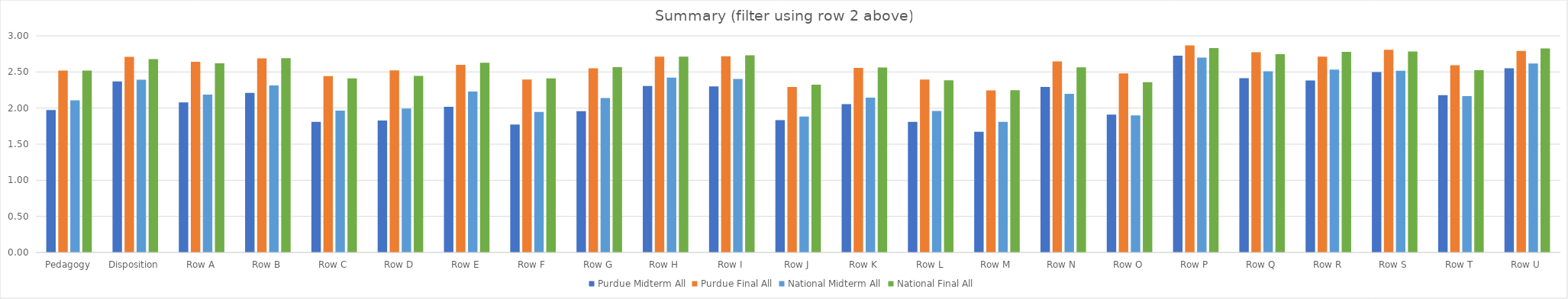
| Category | Purdue | National |
|---|---|---|
| Pedagogy | 2.52 | 2.518 |
| Disposition | 2.709 | 2.677 |
| Row A | 2.641 | 2.618 |
| Row B | 2.689 | 2.69 |
| Row C | 2.443 | 2.411 |
| Row D | 2.521 | 2.447 |
| Row E | 2.599 | 2.629 |
| Row F | 2.395 | 2.411 |
| Row G | 2.551 | 2.568 |
| Row H | 2.713 | 2.713 |
| Row I | 2.719 | 2.731 |
| Row J | 2.293 | 2.323 |
| Row K | 2.557 | 2.562 |
| Row L | 2.395 | 2.385 |
| Row M | 2.246 | 2.246 |
| Row N | 2.647 | 2.564 |
| Row O | 2.479 | 2.359 |
| Row P | 2.868 | 2.832 |
| Row Q | 2.772 | 2.747 |
| Row R | 2.713 | 2.779 |
| Row S | 2.808 | 2.782 |
| Row T | 2.593 | 2.525 |
| Row U | 2.79 | 2.826 |